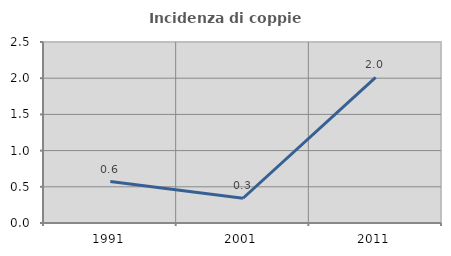
| Category | Incidenza di coppie miste |
|---|---|
| 1991.0 | 0.573 |
| 2001.0 | 0.342 |
| 2011.0 | 2.012 |